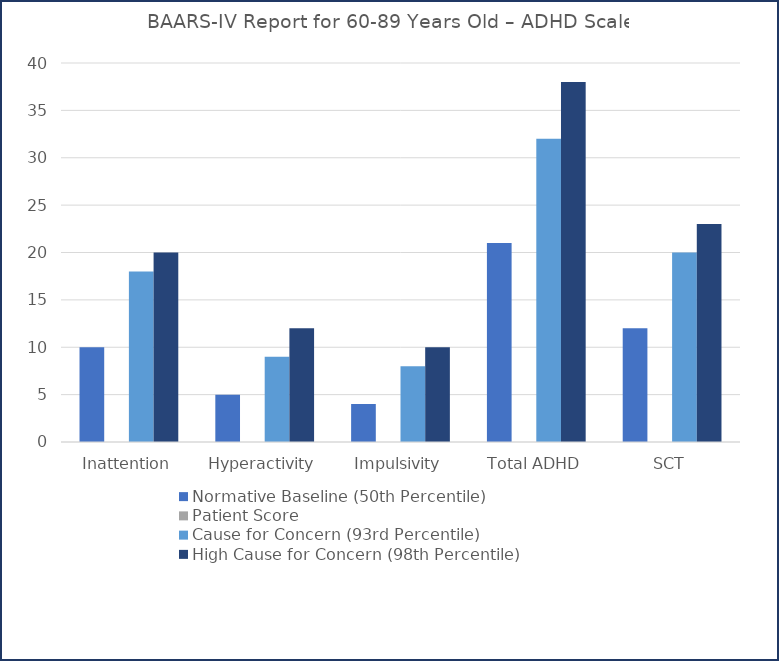
| Category | Normative Baseline (50th Percentile) | Patient Score | Cause for Concern (93rd Percentile) | High Cause for Concern (98th Percentile) |
|---|---|---|---|---|
| Inattention | 10 | 0 | 18 | 20 |
| Hyperactivity | 5 | 0 | 9 | 12 |
| Impulsivity | 4 | 0 | 8 | 10 |
| Total ADHD | 21 | 0 | 32 | 38 |
| SCT | 12 | 0 | 20 | 23 |